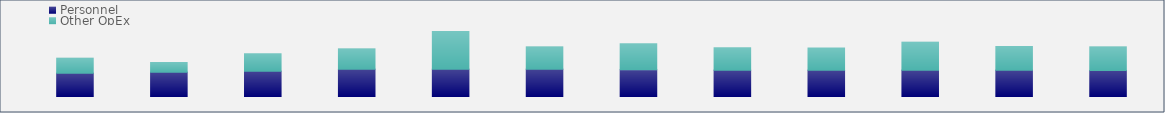
| Category | Personnel | Other OpEx |
|---|---|---|
| Jan-23 | 145415.492 | 91200 |
| Feb-23 | 151728.033 | 59100 |
| Mar-23 | 158571.223 | 105200 |
| Apr-23 | 169664.327 | 122200 |
| May-23 | 169650.848 | 227200 |
| Jun-23 | 169633.588 | 134200 |
| Jul-23 | 167346.425 | 155950 |
| Aug-23 | 164451.865 | 134950 |
| Sep-23 | 163579.436 | 134950 |
| Oct-23 | 163579.022 | 168950 |
| Nov-23 | 163579.022 | 143950 |
| Dec-23 | 163182.65 | 140950 |